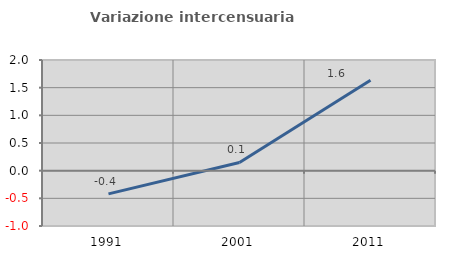
| Category | Variazione intercensuaria annua |
|---|---|
| 1991.0 | -0.42 |
| 2001.0 | 0.148 |
| 2011.0 | 1.632 |